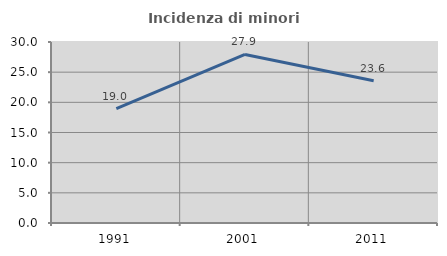
| Category | Incidenza di minori stranieri |
|---|---|
| 1991.0 | 18.966 |
| 2001.0 | 27.941 |
| 2011.0 | 23.585 |